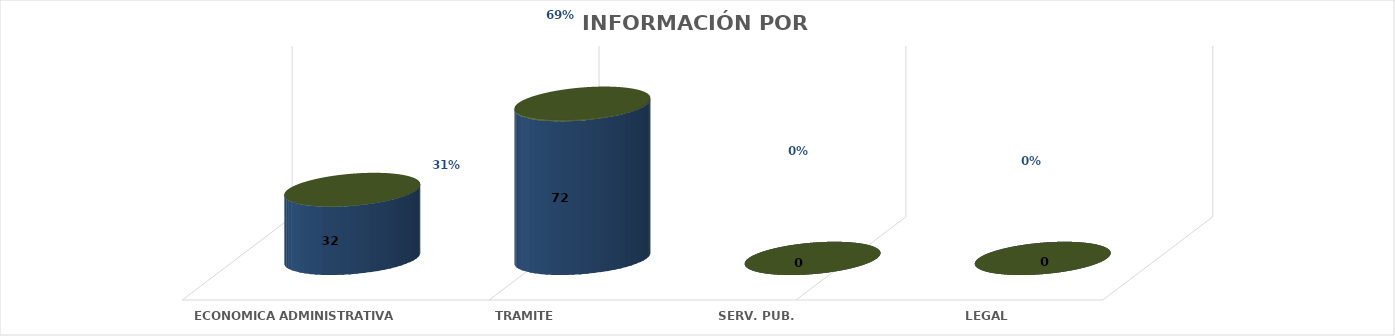
| Category | Series 0 | Series 1 | Series 2 | Series 3 | Series 4 |
|---|---|---|---|---|---|
| ECONOMICA ADMINISTRATIVA |  |  |  | 32 | 0.308 |
| TRAMITE |  |  |  | 72 | 0.692 |
| SERV. PUB. |  |  |  | 0 | 0 |
| LEGAL |  |  |  | 0 | 0 |